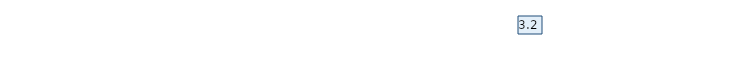
| Category | Итоговая оценка |
|---|---|
| Вопрос 4 | 3.2 |